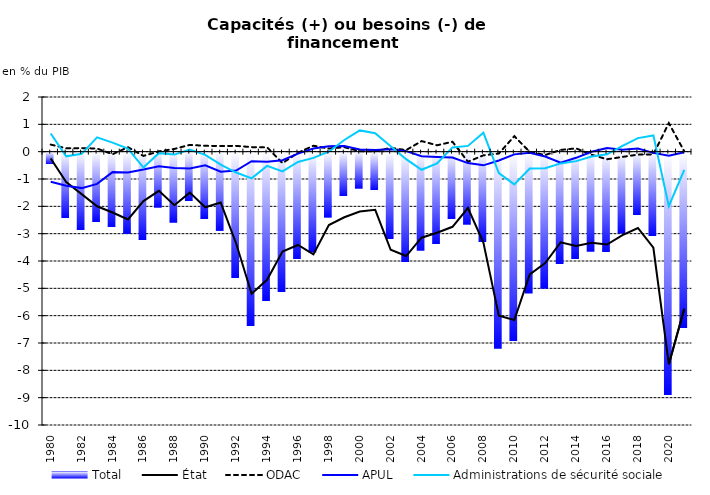
| Category | Total |
|---|---|
| 1980.0 | -0.429 |
| 1981.0 | -2.408 |
| 1982.0 | -2.837 |
| 1983.0 | -2.541 |
| 1984.0 | -2.736 |
| 1985.0 | -2.972 |
| 1986.0 | -3.197 |
| 1987.0 | -2.014 |
| 1988.0 | -2.564 |
| 1989.0 | -1.782 |
| 1990.0 | -2.434 |
| 1991.0 | -2.863 |
| 1992.0 | -4.601 |
| 1993.0 | -6.359 |
| 1994.0 | -5.423 |
| 1995.0 | -5.109 |
| 1996.0 | -3.906 |
| 1997.0 | -3.653 |
| 1998.0 | -2.379 |
| 1999.0 | -1.603 |
| 2000.0 | -1.318 |
| 2001.0 | -1.379 |
| 2002.0 | -3.16 |
| 2003.0 | -4.015 |
| 2004.0 | -3.591 |
| 2005.0 | -3.356 |
| 2006.0 | -2.444 |
| 2007.0 | -2.636 |
| 2008.0 | -3.264 |
| 2009.0 | -7.175 |
| 2010.0 | -6.887 |
| 2011.0 | -5.155 |
| 2012.0 | -4.981 |
| 2013.0 | -4.084 |
| 2014.0 | -3.905 |
| 2015.0 | -3.625 |
| 2016.0 | -3.637 |
| 2017.0 | -2.958 |
| 2018.0 | -2.289 |
| 2019.0 | -3.065 |
| 2020.0 | -8.873 |